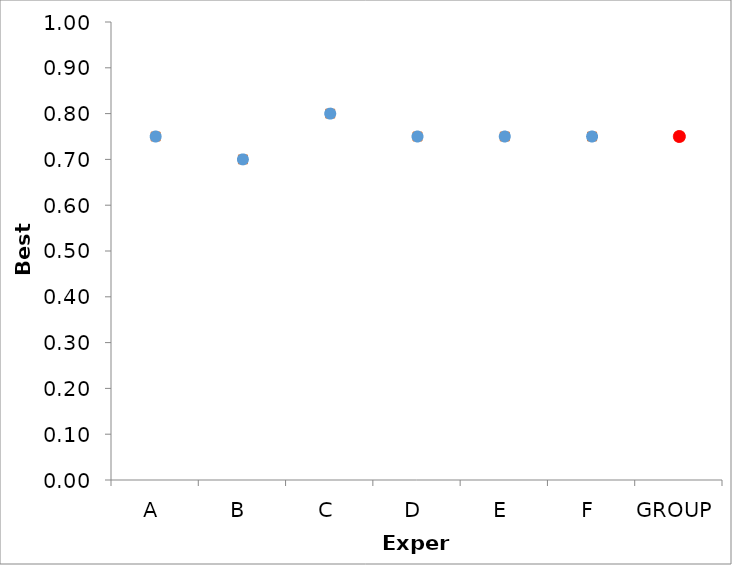
| Category | Series 1 | Series 0 |
|---|---|---|
| A | 0.75 | 0.75 |
| B | 0.7 | 0.7 |
| C | 0.8 | 0.8 |
| D | 0.75 | 0.75 |
| E | 0.75 | 0.75 |
| F | 0.75 | 0.75 |
| GROUP | 0.75 | 0.75 |